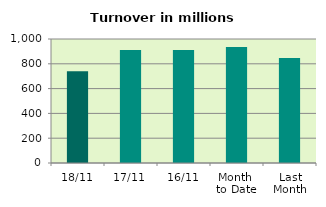
| Category | Series 0 |
|---|---|
| 18/11 | 739.653 |
| 17/11 | 910.977 |
| 16/11 | 910.393 |
| Month 
to Date | 934.718 |
| Last
Month | 847.422 |